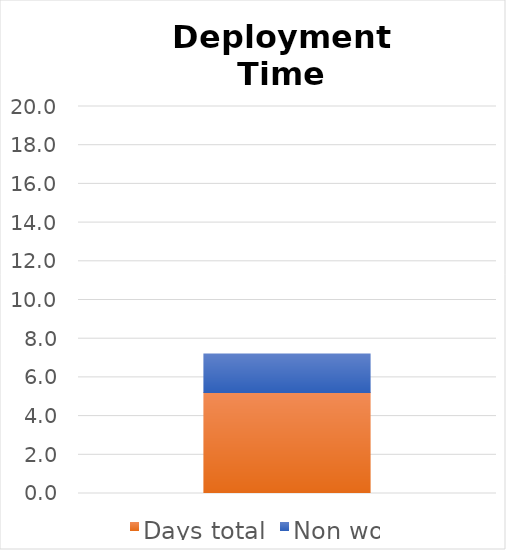
| Category | Days total | Non work days |
|---|---|---|
| 0 | 5.215 | 2 |